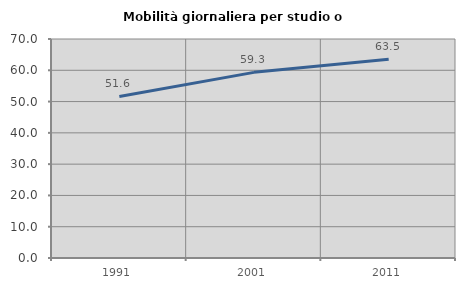
| Category | Mobilità giornaliera per studio o lavoro |
|---|---|
| 1991.0 | 51.625 |
| 2001.0 | 59.336 |
| 2011.0 | 63.526 |